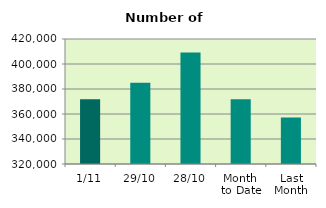
| Category | Series 0 |
|---|---|
| 1/11 | 371706 |
| 29/10 | 384948 |
| 28/10 | 409266 |
| Month 
to Date | 371706 |
| Last
Month | 357160.667 |